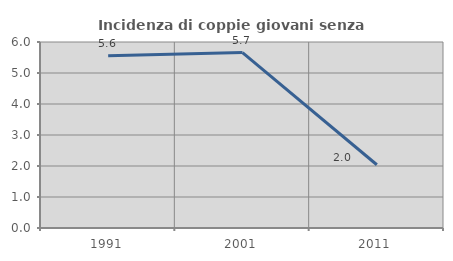
| Category | Incidenza di coppie giovani senza figli |
|---|---|
| 1991.0 | 5.556 |
| 2001.0 | 5.66 |
| 2011.0 | 2.041 |